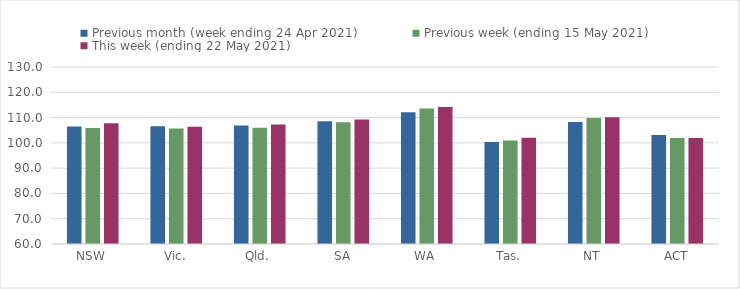
| Category | Previous month (week ending 24 Apr 2021) | Previous week (ending 15 May 2021) | This week (ending 22 May 2021) |
|---|---|---|---|
| NSW | 106.46 | 105.89 | 107.79 |
| Vic. | 106.59 | 105.63 | 106.38 |
| Qld. | 106.85 | 106 | 107.28 |
| SA | 108.53 | 108.16 | 109.2 |
| WA | 112.08 | 113.57 | 114.23 |
| Tas. | 100.35 | 100.98 | 102.06 |
| NT | 108.24 | 109.8 | 110.16 |
| ACT | 103.09 | 101.88 | 101.95 |